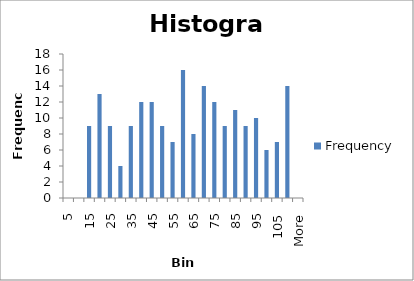
| Category | Frequency |
|---|---|
| 5 | 0 |
| 10 | 0 |
| 15 | 9 |
| 20 | 13 |
| 25 | 9 |
| 30 | 4 |
| 35 | 9 |
| 40 | 12 |
| 45 | 12 |
| 50 | 9 |
| 55 | 7 |
| 60 | 16 |
| 65 | 8 |
| 70 | 14 |
| 75 | 12 |
| 80 | 9 |
| 85 | 11 |
| 90 | 9 |
| 95 | 10 |
| 100 | 6 |
| 105 | 7 |
| 110 | 14 |
| More | 0 |